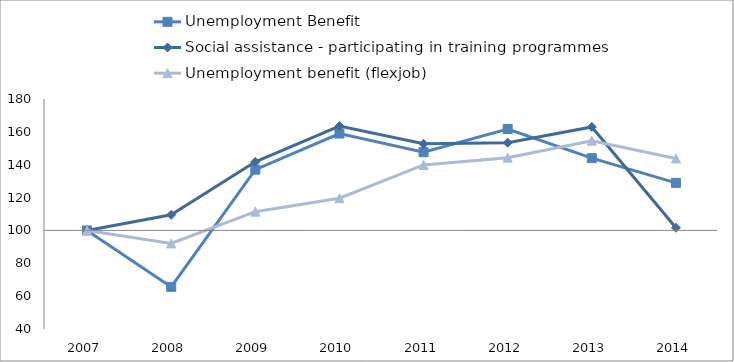
| Category | Unemployment Benefit | Social assistance - participating in training programmes | Unemployment benefit (flexjob) | 0 |
|---|---|---|---|---|
| 2007.0 | 100 | 100 | 100 |  |
| 2008.0 | 65.642 | 109.519 | 92.072 |  |
| 2009.0 | 136.989 | 141.765 | 111.429 |  |
| 2010.0 | 158.954 | 163.489 | 119.611 |  |
| 2011.0 | 147.643 | 152.707 | 139.893 |  |
| 2012.0 | 161.742 | 153.401 | 144.279 |  |
| 2013.0 | 143.98 | 163.004 | 154.637 |  |
| 2014.0 | 128.93 | 101.619 | 143.794 |  |